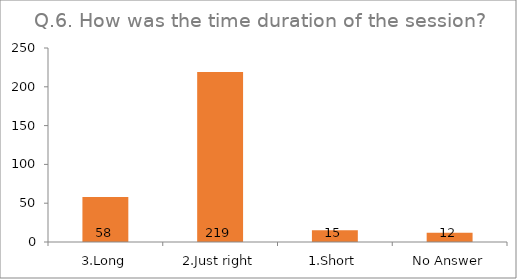
| Category | Q.6. How was the time duration of the session? |
|---|---|
| 3.Long | 58 |
| 2.Just right | 219 |
| 1.Short | 15 |
| No Answer | 12 |